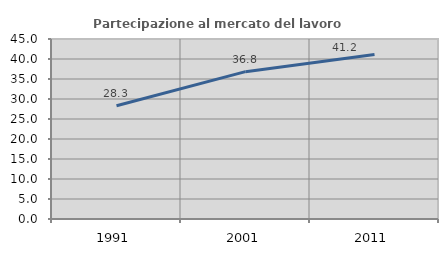
| Category | Partecipazione al mercato del lavoro  femminile |
|---|---|
| 1991.0 | 28.327 |
| 2001.0 | 36.834 |
| 2011.0 | 41.153 |